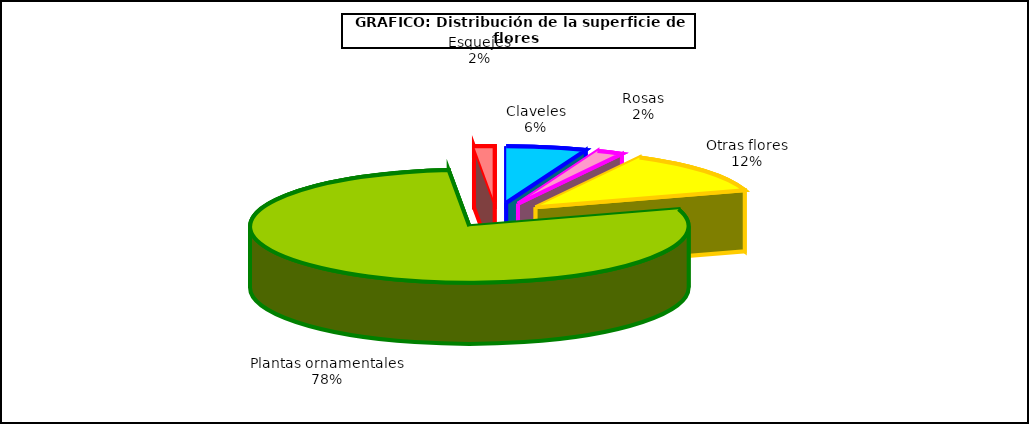
| Category | Series 0 |
|---|---|
| 0 | 37286 |
| 1 | 12371 |
| 2 | 77588 |
| 3 | 495365 |
| 4 | 9496 |